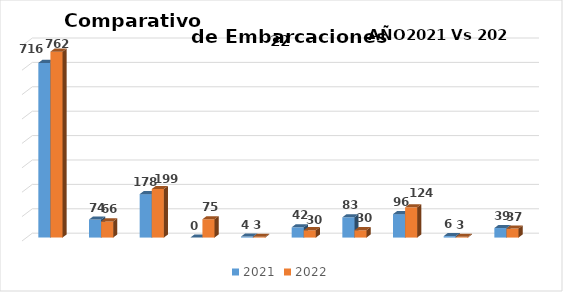
| Category | 2021 | 2022 |
|---|---|---|
| 0 | 716 | 762 |
| 1 | 74 | 66 |
| 2 | 178 | 199 |
| 3 | 0 | 75 |
| 4 | 4 | 3 |
| 5 | 42 | 30 |
| 6 | 83 | 30 |
| 7 | 96 | 124 |
| 8 | 6 | 3 |
| 9 | 39 | 37 |